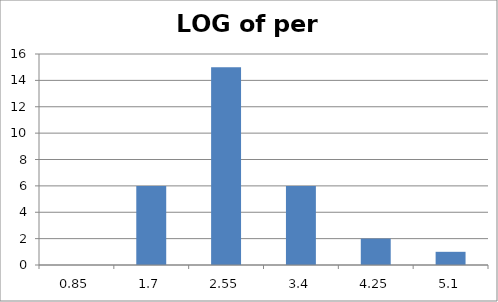
| Category | Series 0 |
|---|---|
| 0.85 | 0 |
| 1.7 | 6 |
| 2.55 | 15 |
| 3.4 | 6 |
| 4.25 | 2 |
| 5.1 | 1 |